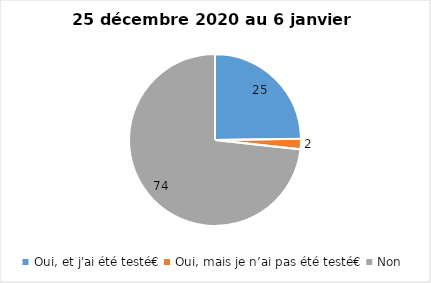
| Category | Series 0 |
|---|---|
| Oui, et j'ai été testé€ | 25 |
| Oui, mais je n’ai pas été testé€ | 2 |
| Non | 74 |